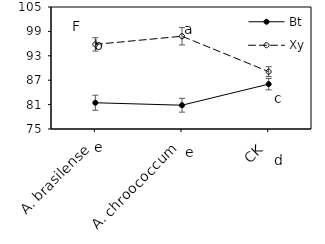
| Category | Bt | Xy |
|---|---|---|
|    A. brasilense | 81.455 | 95.81 |
|    A. chroococcum | 80.848 | 97.81 |
| CK | 86.033 | 89.107 |